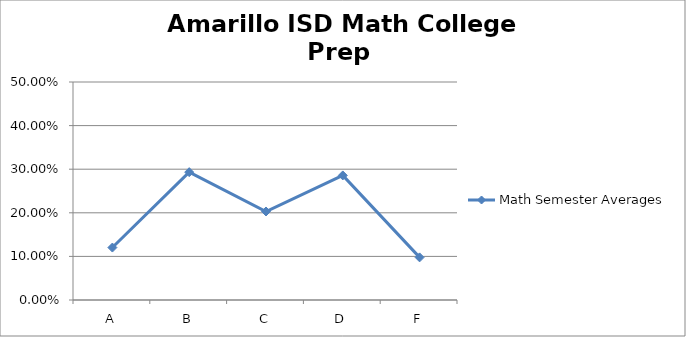
| Category | Math Semester Averages |
|---|---|
| A | 0.12 |
| B | 0.293 |
| C | 0.203 |
| D | 0.286 |
| F | 0.098 |